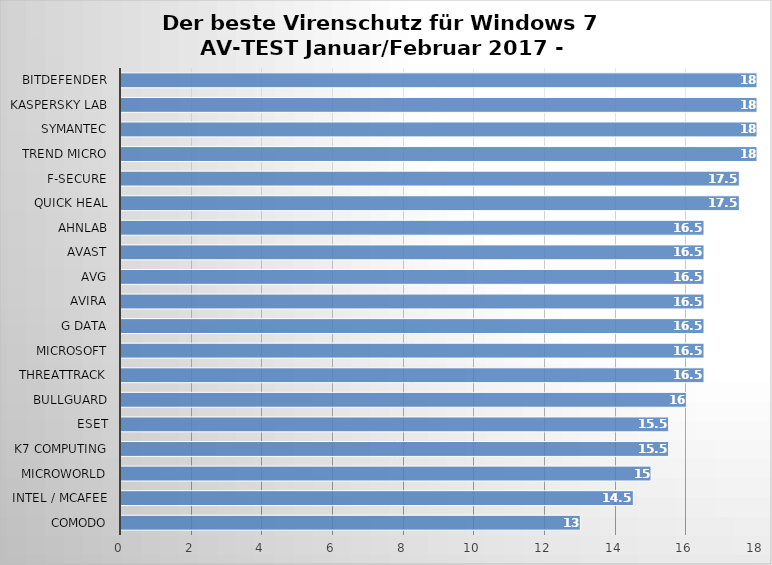
| Category | Series 0 |
|---|---|
| Comodo | 13 |
| Intel / McAfee | 14.5 |
| Microworld | 15 |
| K7 Computing | 15.5 |
| ESET | 15.5 |
| BullGuard | 16 |
| ThreatTrack | 16.5 |
| Microsoft | 16.5 |
| G Data | 16.5 |
| Avira | 16.5 |
| AVG | 16.5 |
| Avast | 16.5 |
| AhnLab | 16.5 |
| Quick Heal | 17.5 |
| F-Secure | 17.5 |
| Trend Micro | 18 |
| Symantec | 18 |
| Kaspersky Lab | 18 |
| Bitdefender | 18 |